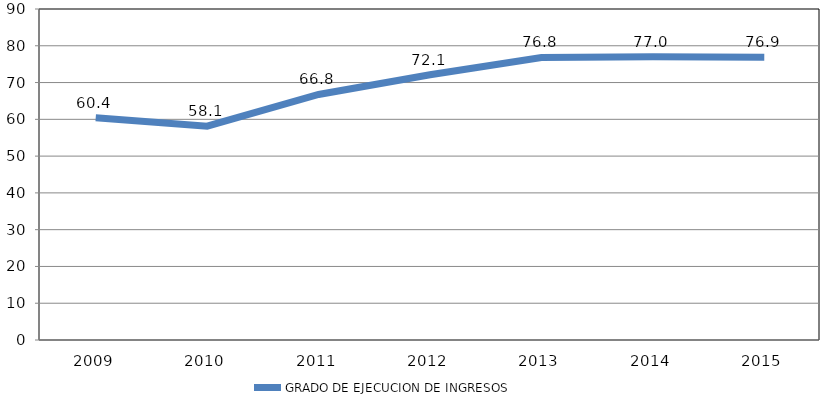
| Category | GRADO DE EJECUCION DE INGRESOS |
|---|---|
| 2009.0 | 60.442 |
| 2010.0 | 58.131 |
| 2011.0 | 66.753 |
| 2012.0 | 72.112 |
| 2013.0 | 76.817 |
| 2014.0 | 76.996 |
| 2015.0 | 76.909 |